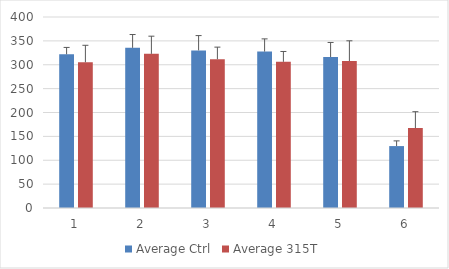
| Category | Average Ctrl | Average 315T |
|---|---|---|
| 0 | 321.889 | 305.222 |
| 1 | 335.389 | 322.778 |
| 2 | 330.056 | 311.556 |
| 3 | 327.611 | 306.111 |
| 4 | 316.222 | 307.778 |
| 5 | 129.667 | 167.333 |